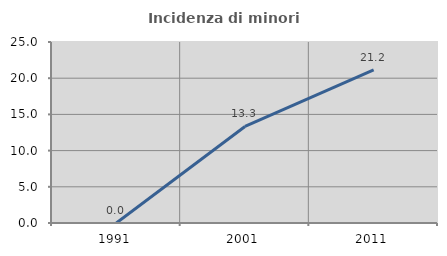
| Category | Incidenza di minori stranieri |
|---|---|
| 1991.0 | 0 |
| 2001.0 | 13.333 |
| 2011.0 | 21.154 |